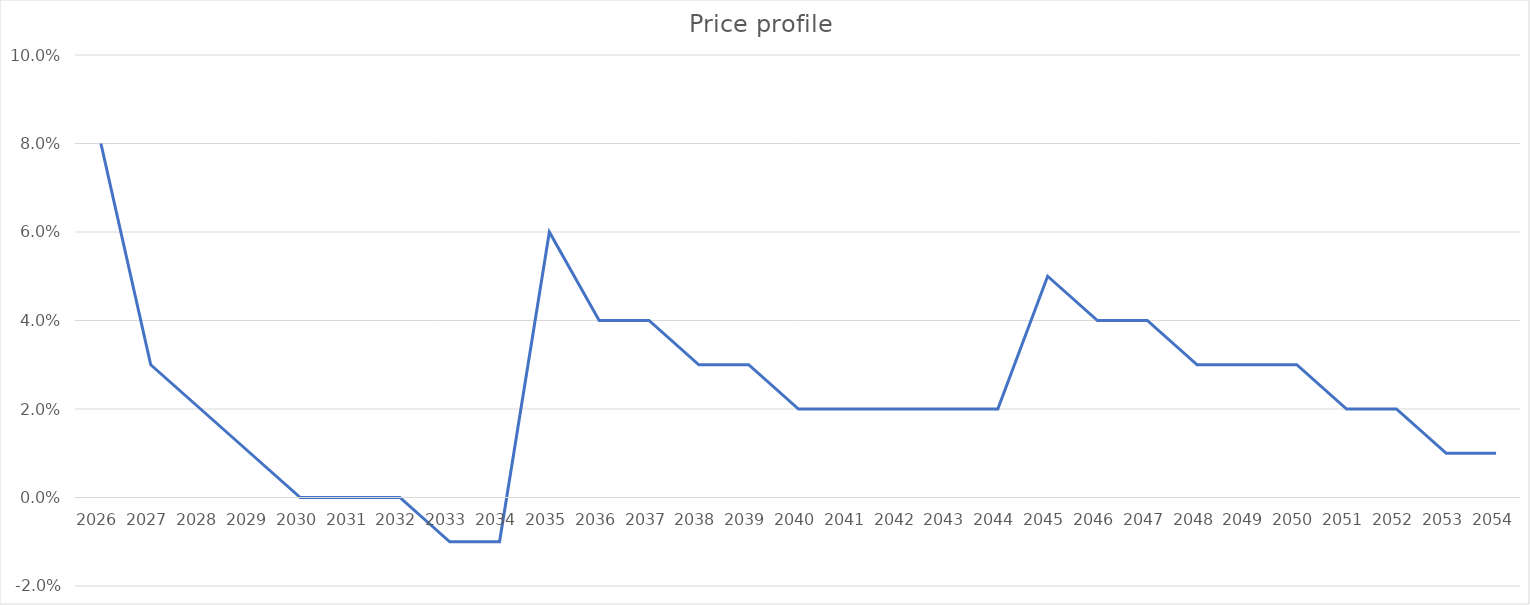
| Category | Series 0 |
|---|---|
| 2026.0 | 0.08 |
| 2027.0 | 0.03 |
| 2028.0 | 0.02 |
| 2029.0 | 0.01 |
| 2030.0 | 0 |
| 2031.0 | 0 |
| 2032.0 | 0 |
| 2033.0 | -0.01 |
| 2034.0 | -0.01 |
| 2035.0 | 0.06 |
| 2036.0 | 0.04 |
| 2037.0 | 0.04 |
| 2038.0 | 0.03 |
| 2039.0 | 0.03 |
| 2040.0 | 0.02 |
| 2041.0 | 0.02 |
| 2042.0 | 0.02 |
| 2043.0 | 0.02 |
| 2044.0 | 0.02 |
| 2045.0 | 0.05 |
| 2046.0 | 0.04 |
| 2047.0 | 0.04 |
| 2048.0 | 0.03 |
| 2049.0 | 0.03 |
| 2050.0 | 0.03 |
| 2051.0 | 0.02 |
| 2052.0 | 0.02 |
| 2053.0 | 0.01 |
| 2054.0 | 0.01 |